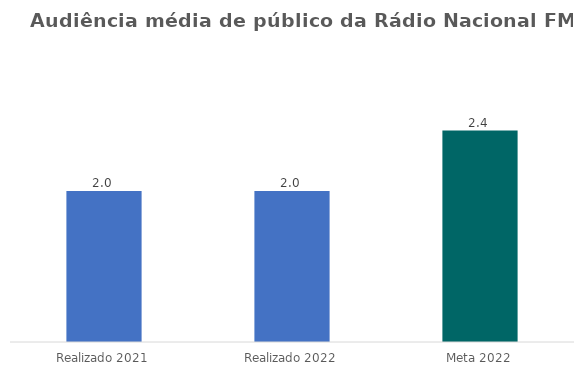
| Category | Series 0 |
|---|---|
| Realizado 2021 | 2 |
| Realizado 2022 | 2 |
| Meta 2022 | 2.4 |